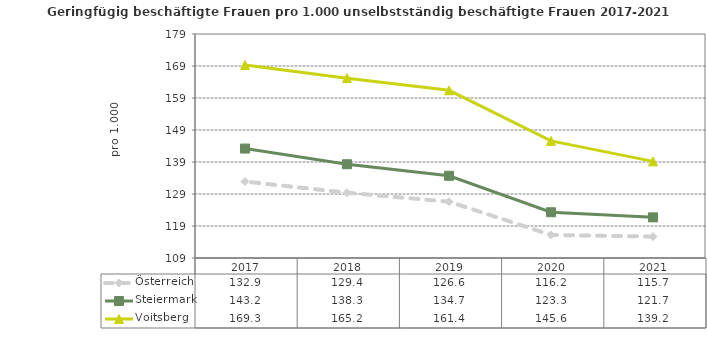
| Category | Österreich | Steiermark | Voitsberg |
|---|---|---|---|
| 2021.0 | 115.7 | 121.7 | 139.2 |
| 2020.0 | 116.2 | 123.3 | 145.6 |
| 2019.0 | 126.6 | 134.7 | 161.4 |
| 2018.0 | 129.4 | 138.3 | 165.2 |
| 2017.0 | 132.9 | 143.2 | 169.3 |